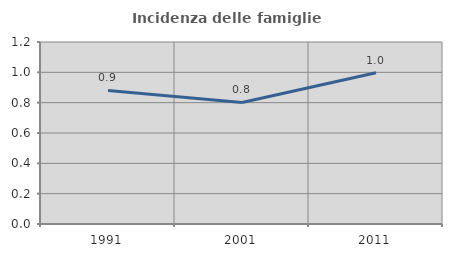
| Category | Incidenza delle famiglie numerose |
|---|---|
| 1991.0 | 0.881 |
| 2001.0 | 0.801 |
| 2011.0 | 0.998 |